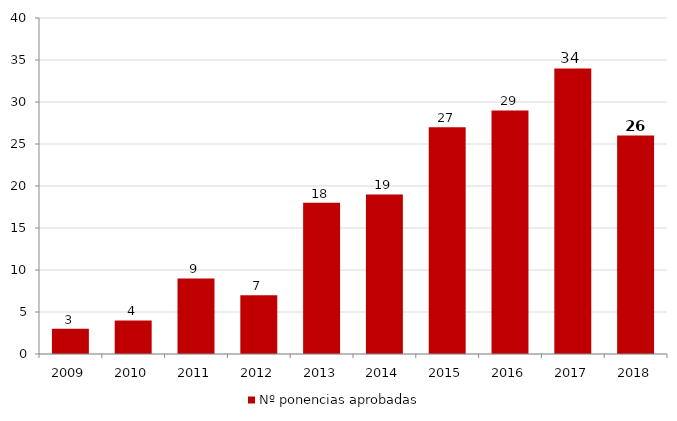
| Category | Nº ponencias aprobadas |
|---|---|
| 2009.0 | 3 |
| 2010.0 | 4 |
| 2011.0 | 9 |
| 2012.0 | 7 |
| 2013.0 | 18 |
| 2014.0 | 19 |
| 2015.0 | 27 |
| 2016.0 | 29 |
| 2017.0 | 34 |
| 2018.0 | 26 |